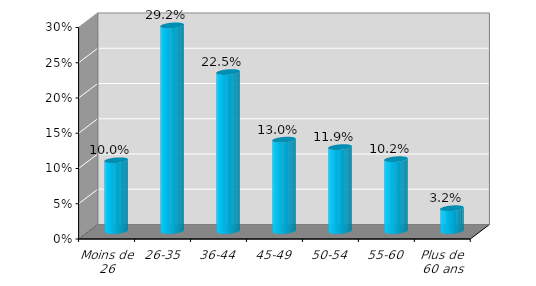
| Category | Globalement / % |
|---|---|
| Moins de 26 | 0.1 |
| 26-35 | 0.292 |
| 36-44 | 0.225 |
| 45-49 | 0.13 |
| 50-54 | 0.119 |
| 55-60 | 0.102 |
| Plus de 60 ans | 0.032 |